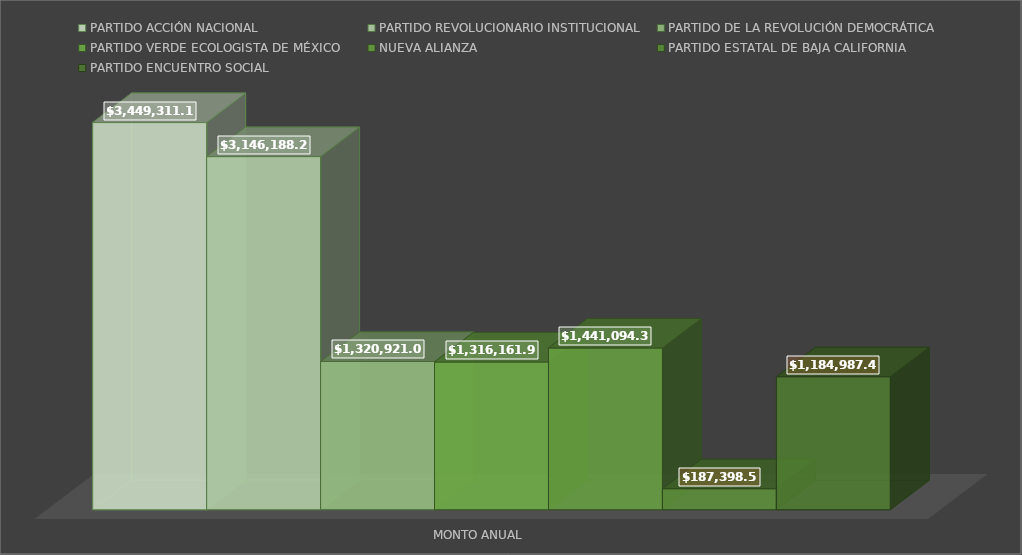
| Category | PARTIDO ACCIÓN NACIONAL | PARTIDO REVOLUCIONARIO INSTITUCIONAL | PARTIDO DE LA REVOLUCIÓN DEMOCRÁTICA | PARTIDO VERDE ECOLOGISTA DE MÉXICO | NUEVA ALIANZA | PARTIDO ESTATAL DE BAJA CALIFORNIA | PARTIDO ENCUENTRO SOCIAL |
|---|---|---|---|---|---|---|---|
| MONTO ANUAL | 3449311.13 | 3146188.2 | 1320921.04 | 1316161.92 | 1441094.31 | 187398.56 | 1184987.48 |